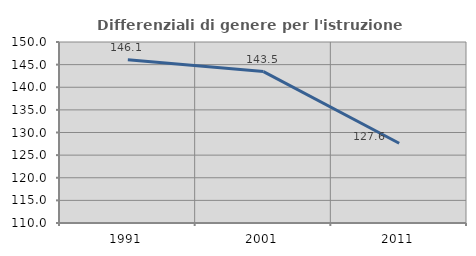
| Category | Differenziali di genere per l'istruzione superiore |
|---|---|
| 1991.0 | 146.101 |
| 2001.0 | 143.458 |
| 2011.0 | 127.629 |